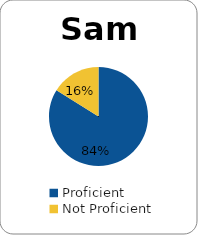
| Category | Series 0 |
|---|---|
| Proficient | 0.839 |
| Not Proficient | 0.161 |